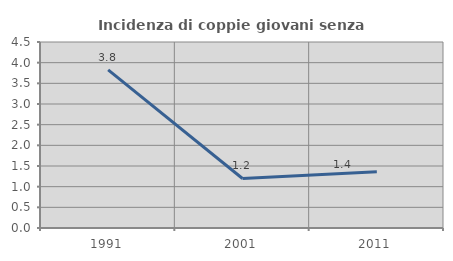
| Category | Incidenza di coppie giovani senza figli |
|---|---|
| 1991.0 | 3.825 |
| 2001.0 | 1.198 |
| 2011.0 | 1.361 |